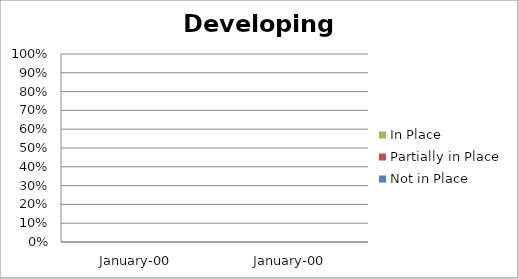
| Category | Not in Place | Partially in Place | In Place |
|---|---|---|---|
| 0.0 | 0 | 0 | 0 |
| 0.0 | 0 | 0 | 0 |